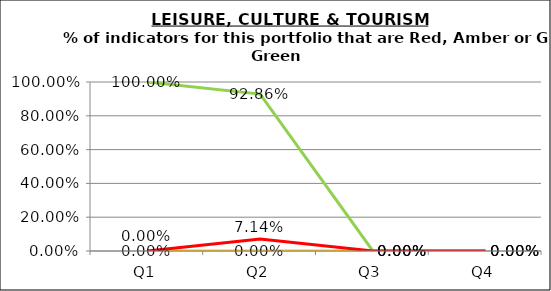
| Category | Green | Amber | Red |
|---|---|---|---|
| Q1 | 1 | 0 | 0 |
| Q2 | 0.929 | 0 | 0.071 |
| Q3 | 0 | 0 | 0 |
| Q4 | 0 | 0 | 0 |